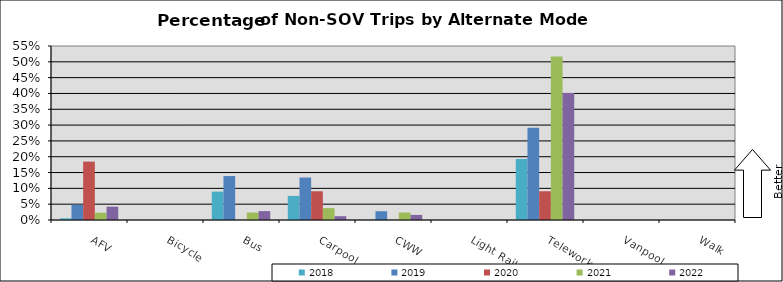
| Category | 2018 | 2019 | 2020 | 2021 | 2022 |
|---|---|---|---|---|---|
| AFV | 0.005 | 0.048 | 0.185 | 0.023 | 0.042 |
| Bicycle | 0 | 0 | 0 | 0 | 0 |
| Bus | 0.09 | 0.139 | 0 | 0.023 | 0.028 |
| Carpool | 0.076 | 0.134 | 0.091 | 0.038 | 0.012 |
| CWW | 0 | 0.028 | 0 | 0.023 | 0.016 |
| Light Rail | 0 | 0 | 0 | 0 | 0 |
| Telework | 0.193 | 0.292 | 0.091 | 0.516 | 0.402 |
| Vanpool | 0 | 0 | 0 | 0 | 0 |
| Walk | 0 | 0 | 0 | 0 | 0 |